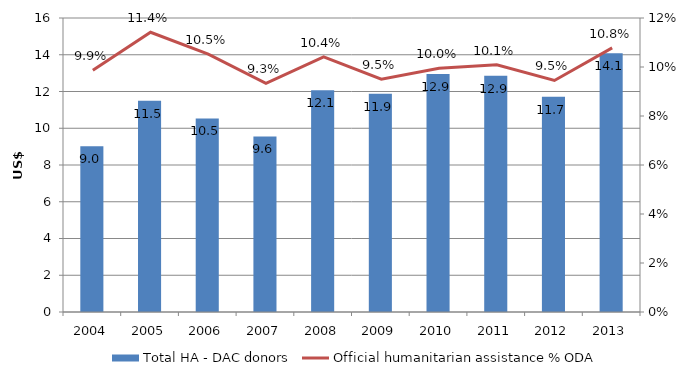
| Category | Total HA - DAC donors |
|---|---|
| 2004.0 | 9.024 |
| 2005.0 | 11.492 |
| 2006.0 | 10.535 |
| 2007.0 | 9.553 |
| 2008.0 | 12.062 |
| 2009.0 | 11.879 |
| 2010.0 | 12.947 |
| 2011.0 | 12.86 |
| 2012.0 | 11.714 |
| 2013.0 | 14.085 |